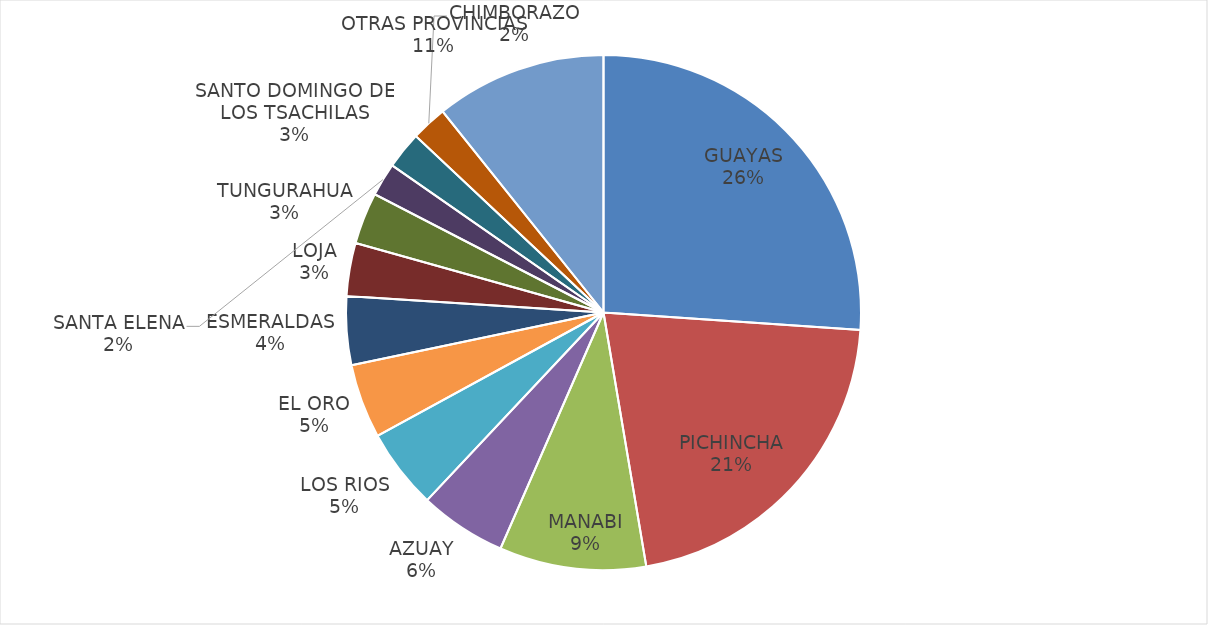
| Category | Series 0 |
|---|---|
| GUAYAS | 223436.86 |
| PICHINCHA | 182093.992 |
| MANABI | 78866.33 |
| AZUAY | 46715 |
| LOS RIOS | 43234.318 |
| EL ORO | 39934.172 |
| ESMERALDAS | 36938.249 |
| LOJA | 28476.93 |
| TUNGURAHUA | 27794.369 |
| SANTA ELENA | 17831 |
| SANTO DOMINGO DE LOS TSACHILAS | 19982.679 |
| CHIMBORAZO | 19255 |
| OTRAS PROVINCIAS | 92037 |